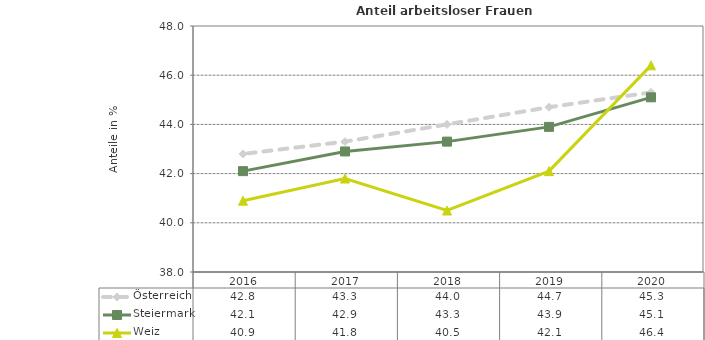
| Category | Österreich | Steiermark | Weiz |
|---|---|---|---|
| 2020.0 | 45.3 | 45.1 | 46.4 |
| 2019.0 | 44.7 | 43.9 | 42.1 |
| 2018.0 | 44 | 43.3 | 40.5 |
| 2017.0 | 43.3 | 42.9 | 41.8 |
| 2016.0 | 42.8 | 42.1 | 40.9 |